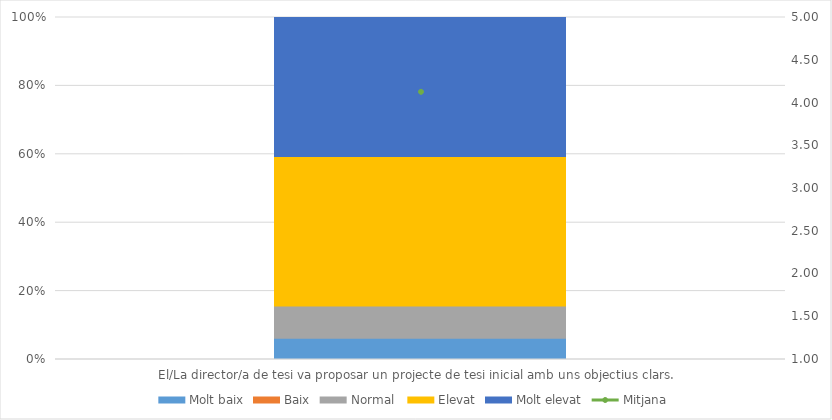
| Category | Molt baix | Baix | Normal  | Elevat | Molt elevat |
|---|---|---|---|---|---|
| El/La director/a de tesi va proposar un projecte de tesi inicial amb uns objectius clars.  | 2 | 0 | 3 | 14 | 13 |